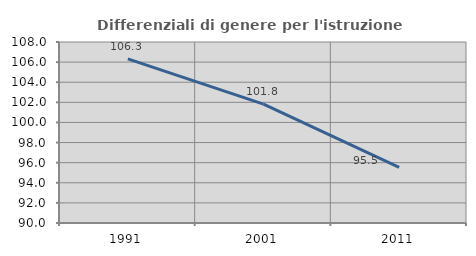
| Category | Differenziali di genere per l'istruzione superiore |
|---|---|
| 1991.0 | 106.315 |
| 2001.0 | 101.825 |
| 2011.0 | 95.541 |